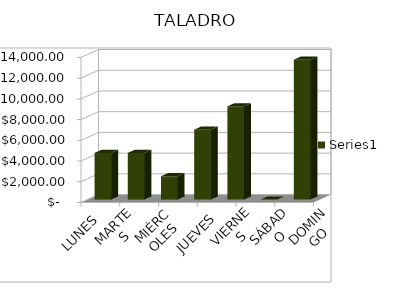
| Category | Series 0 |
|---|---|
| LUNES | 4500 |
| MARTES | 4500 |
| MIÉRCOLES | 2250 |
| JUEVES | 6750 |
| VIERNES | 9000 |
| SÁBADO | 0 |
| DOMINGO | 13500 |